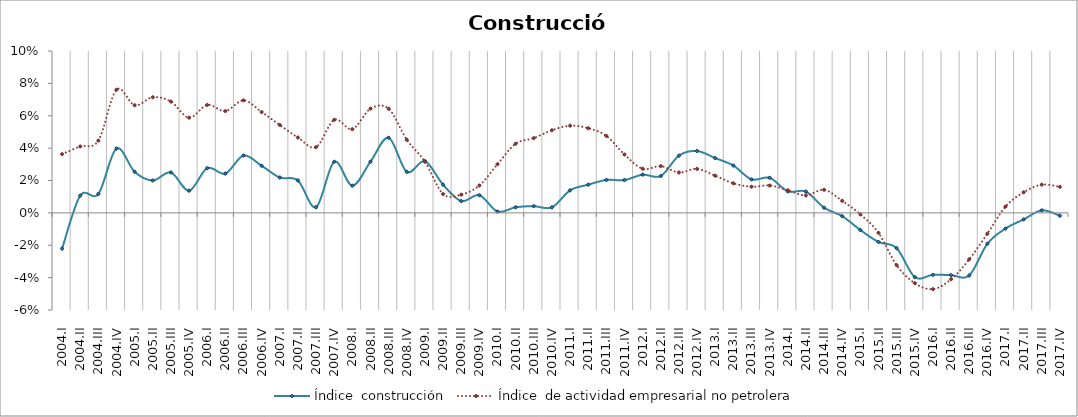
| Category | Índice  construcción | Índice  de actividad empresarial no petrolera |
|---|---|---|
| 2004.I | -0.022 | 0.036 |
| 2004.II | 0.011 | 0.041 |
| 2004.III | 0.012 | 0.045 |
| 2004.IV | 0.04 | 0.076 |
| 2005.I | 0.025 | 0.066 |
| 2005.II | 0.02 | 0.071 |
| 2005.III | 0.025 | 0.069 |
| 2005.IV | 0.014 | 0.059 |
| 2006.I | 0.028 | 0.067 |
| 2006.II | 0.024 | 0.063 |
| 2006.III | 0.035 | 0.07 |
| 2006.IV | 0.029 | 0.062 |
| 2007.I | 0.022 | 0.054 |
| 2007.II | 0.02 | 0.047 |
| 2007.III | 0.003 | 0.041 |
| 2007.IV | 0.032 | 0.057 |
| 2008.I | 0.017 | 0.052 |
| 2008.II | 0.032 | 0.064 |
| 2008.III | 0.046 | 0.064 |
| 2008.IV | 0.025 | 0.045 |
| 2009.I | 0.032 | 0.032 |
| 2009.II | 0.017 | 0.012 |
| 2009.III | 0.007 | 0.011 |
| 2009.IV | 0.011 | 0.017 |
| 2010.I | 0.001 | 0.03 |
| 2010.II | 0.003 | 0.043 |
| 2010.III | 0.004 | 0.046 |
| 2010.IV | 0.003 | 0.051 |
| 2011.I | 0.014 | 0.054 |
| 2011.II | 0.017 | 0.052 |
| 2011.III | 0.02 | 0.048 |
| 2011.IV | 0.02 | 0.036 |
| 2012.I | 0.024 | 0.027 |
| 2012.II | 0.023 | 0.029 |
| 2012.III | 0.035 | 0.025 |
| 2012.IV | 0.038 | 0.027 |
| 2013.I | 0.034 | 0.023 |
| 2013.II | 0.029 | 0.018 |
| 2013.III | 0.021 | 0.016 |
| 2013.IV | 0.022 | 0.017 |
| 2014.I | 0.013 | 0.014 |
| 2014.II | 0.013 | 0.011 |
| 2014.III | 0.003 | 0.014 |
| 2014.IV | -0.002 | 0.007 |
| 2015.I | -0.011 | -0.001 |
| 2015.II | -0.018 | -0.012 |
| 2015.III | -0.022 | -0.032 |
| 2015.IV | -0.04 | -0.043 |
| 2016.I | -0.038 | -0.047 |
| 2016.II | -0.038 | -0.041 |
| 2016.III | -0.039 | -0.029 |
| 2016.IV | -0.019 | -0.013 |
| 2017.I | -0.01 | 0.004 |
| 2017.II | -0.004 | 0.013 |
| 2017.III | 0.002 | 0.017 |
| 2017.IV | -0.002 | 0.016 |